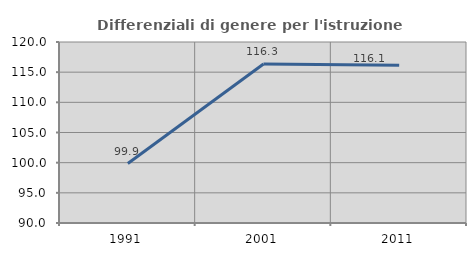
| Category | Differenziali di genere per l'istruzione superiore |
|---|---|
| 1991.0 | 99.862 |
| 2001.0 | 116.345 |
| 2011.0 | 116.148 |